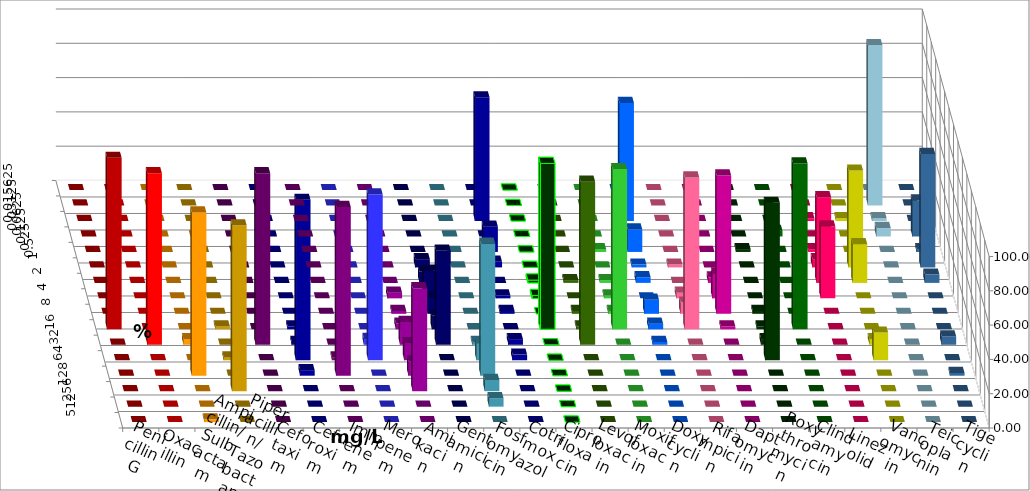
| Category | Penicillin G | Oxacillin | Ampicillin/ Sulbactam | Piperacillin/ Tazobactam | Cefotaxim | Cefuroxim | Imipenem | Meropenem | Amikacin | Gentamicin | Fosfomycin | Cotrimoxazol | Ciprofloxacin | Levofloxacin | Moxifloxacin | Doxycyclin | Rifampicin | Daptomycin | Roxythromycin | Clindamycin | Linezolid | Vancomycin | Teicoplanin | Tigecyclin |
|---|---|---|---|---|---|---|---|---|---|---|---|---|---|---|---|---|---|---|---|---|---|---|---|---|
| 0.015625 | 0 | 0 | 0 | 0 | 0 | 0 | 0 | 0 | 0 | 0 | 0 | 0 | 0 | 0 | 0 | 0 | 0 | 0 | 0 | 0 | 0 | 0 | 0 | 0 |
| 0.03125 | 0 | 0 | 0 | 0 | 0 | 0 | 0 | 0 | 0 | 0 | 0 | 0 | 0 | 0 | 0 | 0 | 0 | 0 | 0 | 0 | 0 | 0 | 0 | 93.443 |
| 0.0625 | 0 | 0 | 0 | 0 | 0 | 0 | 0 | 0 | 0 | 0 | 0 | 72.131 | 0 | 0 | 0 | 68.852 | 0 | 0 | 0 | 0 | 1.613 | 1.613 | 0 | 1.639 |
| 0.125 | 0 | 0 | 0 | 0 | 0 | 0 | 0 | 0 | 0 | 0 | 0 | 0 | 0 | 0 | 0 | 0 | 0 | 0 | 0 | 3.279 | 0 | 0 | 20.968 | 4.918 |
| 0.25 | 0 | 0 | 0 | 0 | 0 | 0 | 0 | 0 | 0 | 0 | 0 | 14.754 | 0 | 0 | 1.639 | 13.115 | 0 | 0 | 1.639 | 0 | 1.613 | 0 | 1.613 | 0 |
| 0.5 | 0 | 0 | 0 | 0 | 0 | 0 | 0 | 0 | 0 | 4.839 | 0 | 3.279 | 0 | 0 | 0 | 1.639 | 1.639 | 0 | 0 | 0 | 4.839 | 56.452 | 66.129 | 0 |
| 1.0 | 0 | 0 | 0 | 0 | 0 | 0 | 0 | 0 | 0 | 6.452 | 0 | 0 | 1.639 | 1.639 | 1.639 | 3.279 | 0 | 3.226 | 0 | 0 | 50 | 22.581 | 4.839 | 0 |
| 2.0 | 0 | 0 | 0 | 0 | 0 | 0 | 0 | 0 | 3.333 | 16.129 | 0 | 1.639 | 1.639 | 0 | 1.639 | 0 | 3.279 | 14.516 | 0 | 0 | 41.935 | 0 | 0 | 0 |
| 4.0 | 0 | 0 | 0 | 0 | 0 | 0 | 0 | 0 | 1.667 | 9.677 | 0 | 1.639 | 0 | 1.639 | 1.639 | 8.197 | 6.557 | 80.645 | 1.639 | 0 | 0 | 0 | 0 | 0 |
| 8.0 | 100 | 0 | 0 | 1.639 | 0 | 0 | 1.613 | 0 | 3.333 | 8.065 | 0 | 0 | 96.721 | 1.639 | 93.443 | 3.279 | 88.525 | 1.613 | 1.639 | 96.721 | 0 | 0 | 0 | 0 |
| 16.0 | 0 | 100 | 3.226 | 0 | 100 | 0 | 1.613 | 3.333 | 13.333 | 54.839 | 1.639 | 3.279 | 0 | 95.082 | 0 | 1.639 | 0 | 0 | 3.279 | 0 | 0 | 3.226 | 4.839 | 0 |
| 32.0 | 0 | 0 | 0 | 1.639 | 0 | 1.639 | 93.548 | 96.667 | 10 | 0 | 9.836 | 3.279 | 0 | 0 | 0 | 0 | 0 | 0 | 91.803 | 0 | 0 | 16.129 | 0 | 0 |
| 64.0 | 0 | 0 | 95.161 | 0 | 0 | 98.361 | 3.226 | 0 | 8.333 | 0 | 77.049 | 0 | 0 | 0 | 0 | 0 | 0 | 0 | 0 | 0 | 0 | 0 | 1.613 | 0 |
| 128.0 | 0 | 0 | 0 | 96.721 | 0 | 0 | 0 | 0 | 60 | 0 | 6.557 | 0 | 0 | 0 | 0 | 0 | 0 | 0 | 0 | 0 | 0 | 0 | 0 | 0 |
| 256.0 | 0 | 0 | 0 | 0 | 0 | 0 | 0 | 0 | 0 | 0 | 4.918 | 0 | 0 | 0 | 0 | 0 | 0 | 0 | 0 | 0 | 0 | 0 | 0 | 0 |
| 512.0 | 0 | 0 | 1.613 | 0 | 0 | 0 | 0 | 0 | 0 | 0 | 0 | 0 | 0 | 0 | 0 | 0 | 0 | 0 | 0 | 0 | 0 | 0 | 0 | 0 |